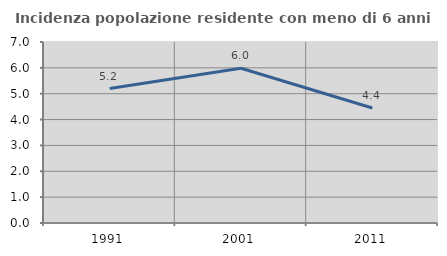
| Category | Incidenza popolazione residente con meno di 6 anni |
|---|---|
| 1991.0 | 5.2 |
| 2001.0 | 5.983 |
| 2011.0 | 4.447 |